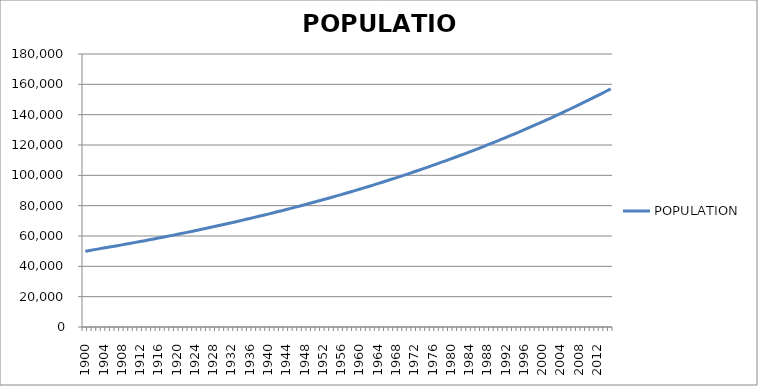
| Category | POPULATION |
|---|---|
| 1900 | 50000 |
| 1901 | 50500 |
| 1902 | 51005 |
| 1903 | 51515.05 |
| 1904 | 52030.201 |
| 1905 | 52550.503 |
| 1906 | 53076.008 |
| 1907 | 53606.768 |
| 1908 | 54142.835 |
| 1909 | 54684.264 |
| 1910 | 55231.106 |
| 1911 | 55783.417 |
| 1912 | 56341.252 |
| 1913 | 56904.664 |
| 1914 | 57473.711 |
| 1915 | 58048.448 |
| 1916 | 58628.932 |
| 1917 | 59215.222 |
| 1918 | 59807.374 |
| 1919 | 60405.448 |
| 1920 | 61009.502 |
| 1921 | 61619.597 |
| 1922 | 62235.793 |
| 1923 | 62858.151 |
| 1924 | 63486.732 |
| 1925 | 64121.6 |
| 1926 | 64762.816 |
| 1927 | 65410.444 |
| 1928 | 66064.548 |
| 1929 | 66725.194 |
| 1930 | 67392.446 |
| 1931 | 68066.37 |
| 1932 | 68747.034 |
| 1933 | 69434.504 |
| 1934 | 70128.849 |
| 1935 | 70830.138 |
| 1936 | 71538.439 |
| 1937 | 72253.824 |
| 1938 | 72976.362 |
| 1939 | 73706.125 |
| 1940 | 74443.187 |
| 1941 | 75187.619 |
| 1942 | 75939.495 |
| 1943 | 76698.89 |
| 1944 | 77465.879 |
| 1945 | 78240.537 |
| 1946 | 79022.943 |
| 1947 | 79813.172 |
| 1948 | 80611.304 |
| 1949 | 81417.417 |
| 1950 | 82231.591 |
| 1951 | 83053.907 |
| 1952 | 83884.446 |
| 1953 | 84723.291 |
| 1954 | 85570.523 |
| 1955 | 86426.229 |
| 1956 | 87290.491 |
| 1957 | 88163.396 |
| 1958 | 89045.03 |
| 1959 | 89935.48 |
| 1960 | 90834.835 |
| 1961 | 91743.183 |
| 1962 | 92660.615 |
| 1963 | 93587.221 |
| 1964 | 94523.093 |
| 1965 | 95468.324 |
| 1966 | 96423.008 |
| 1967 | 97387.238 |
| 1968 | 98361.11 |
| 1969 | 99344.721 |
| 1970 | 100338.168 |
| 1971 | 101341.55 |
| 1972 | 102354.966 |
| 1973 | 103378.515 |
| 1974 | 104412.3 |
| 1975 | 105456.423 |
| 1976 | 106510.988 |
| 1977 | 107576.098 |
| 1978 | 108651.859 |
| 1979 | 109738.377 |
| 1980 | 110835.761 |
| 1981 | 111944.118 |
| 1982 | 113063.56 |
| 1983 | 114194.195 |
| 1984 | 115336.137 |
| 1985 | 116489.499 |
| 1986 | 117654.394 |
| 1987 | 118830.937 |
| 1988 | 120019.247 |
| 1989 | 121219.439 |
| 1990 | 122431.634 |
| 1991 | 123655.95 |
| 1992 | 124892.51 |
| 1993 | 126141.435 |
| 1994 | 127402.849 |
| 1995 | 128676.878 |
| 1996 | 129963.646 |
| 1997 | 131263.283 |
| 1998 | 132575.916 |
| 1999 | 133901.675 |
| 2000 | 135240.691 |
| 2001 | 136593.098 |
| 2002 | 137959.029 |
| 2003 | 139338.62 |
| 2004 | 140732.006 |
| 2005 | 142139.326 |
| 2006 | 143560.719 |
| 2007 | 144996.326 |
| 2008 | 146446.29 |
| 2009 | 147910.753 |
| 2010 | 149389.86 |
| 2011 | 150883.759 |
| 2012 | 152392.596 |
| 2013 | 153916.522 |
| 2014 | 155455.687 |
| 2015 | 157010.244 |